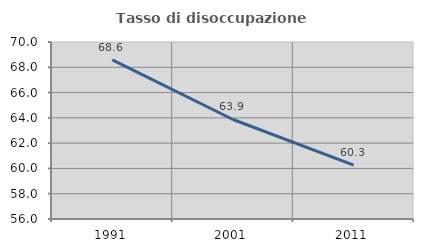
| Category | Tasso di disoccupazione giovanile  |
|---|---|
| 1991.0 | 68.59 |
| 2001.0 | 63.871 |
| 2011.0 | 60.256 |